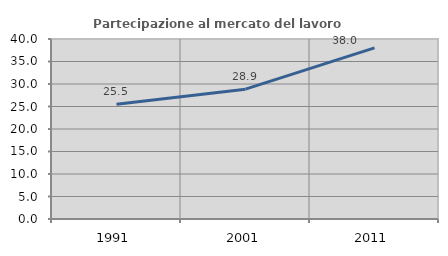
| Category | Partecipazione al mercato del lavoro  femminile |
|---|---|
| 1991.0 | 25.485 |
| 2001.0 | 28.855 |
| 2011.0 | 38.038 |